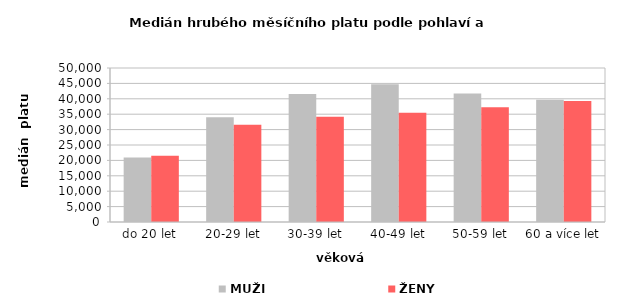
| Category | MUŽI | ŽENY |
|---|---|---|
| 0 | 20904.167 | 21486.167 |
| 1 | 33986.257 | 31599.669 |
| 2 | 41536.993 | 34144.204 |
| 3 | 44736.216 | 35438.889 |
| 4 | 41681.734 | 37249.516 |
| 5 | 39729.359 | 39257.859 |